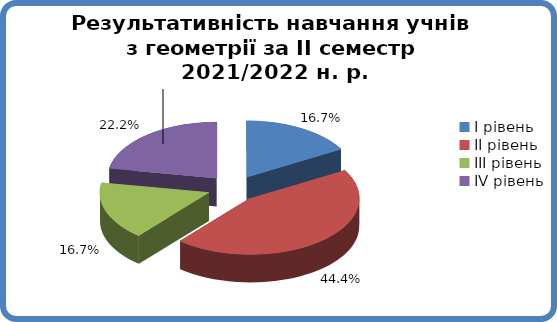
| Category | Series 0 |
|---|---|
| 0 | 0.167 |
| 1 | 0.444 |
| 2 | 0.167 |
| 3 | 0.222 |